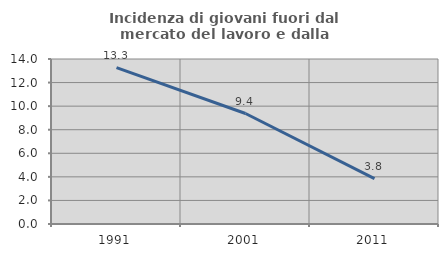
| Category | Incidenza di giovani fuori dal mercato del lavoro e dalla formazione  |
|---|---|
| 1991.0 | 13.265 |
| 2001.0 | 9.375 |
| 2011.0 | 3.846 |